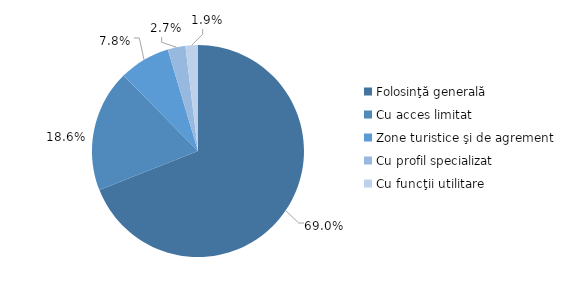
| Category | Series 0 |
|---|---|
| Folosinţă generală | 0.69 |
| Cu acces limitat | 0.186 |
| Zone turistice şi de agrement | 0.078 |
| Cu profil specializat | 0.027 |
| Cu funcţii utilitare | 0.019 |